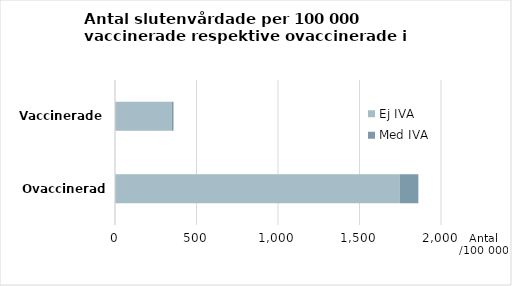
| Category | Ej IVA | Med IVA |
|---|---|---|
| Ovaccinerade  | 1747.823 | 113.291 |
| Vaccinerade  | 348.233 | 10.632 |